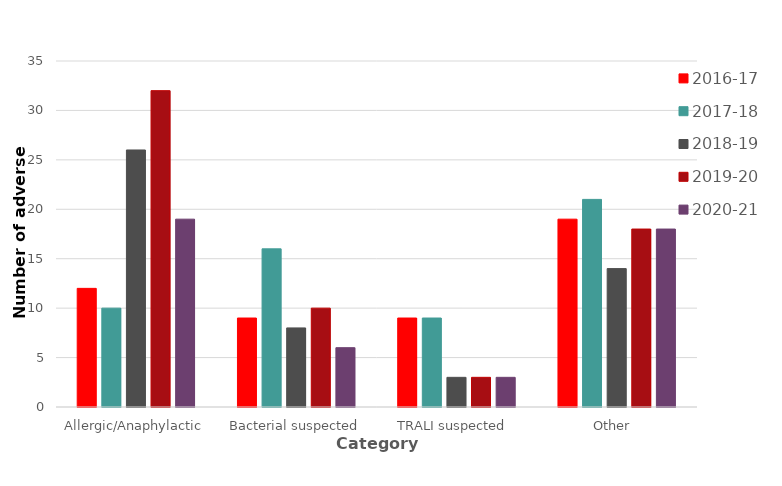
| Category | 2016-17 | 2017-18 | 2018-19 | 2019-20 | 2020-21 |
|---|---|---|---|---|---|
| Allergic/Anaphylactic | 12 | 10 | 26 | 32 | 19 |
| Bacterial suspected | 9 | 16 | 8 | 10 | 6 |
| TRALI suspected  | 9 | 9 | 3 | 3 | 3 |
| Other  | 19 | 21 | 14 | 18 | 18 |